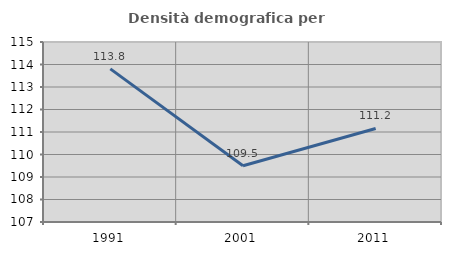
| Category | Densità demografica |
|---|---|
| 1991.0 | 113.806 |
| 2001.0 | 109.501 |
| 2011.0 | 111.156 |